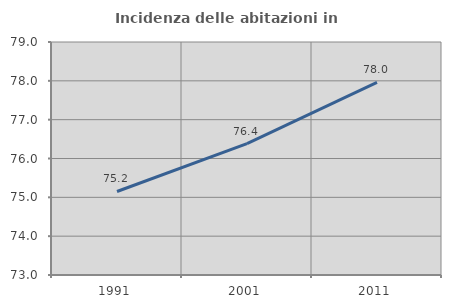
| Category | Incidenza delle abitazioni in proprietà  |
|---|---|
| 1991.0 | 75.151 |
| 2001.0 | 76.383 |
| 2011.0 | 77.958 |